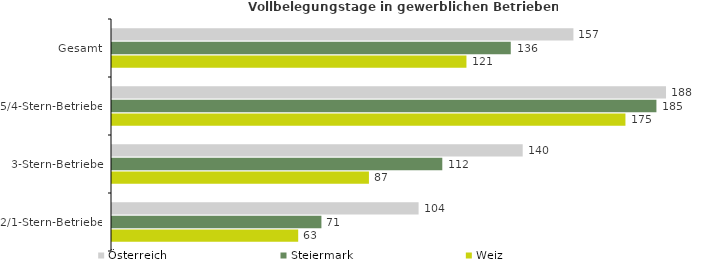
| Category | Österreich | Steiermark | Weiz |
|---|---|---|---|
| Gesamt | 156.946 | 135.634 | 120.56 |
| 5/4-Stern-Betriebe | 188.443 | 185.178 | 174.639 |
| 3-Stern-Betriebe | 139.696 | 112.345 | 87.391 |
| 2/1-Stern-Betriebe | 104.286 | 71.229 | 63.332 |